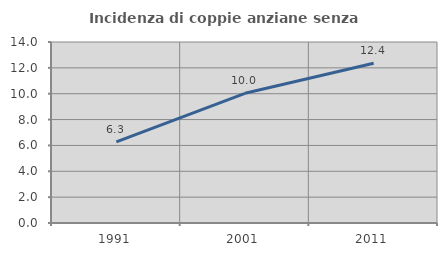
| Category | Incidenza di coppie anziane senza figli  |
|---|---|
| 1991.0 | 6.276 |
| 2001.0 | 10.031 |
| 2011.0 | 12.351 |